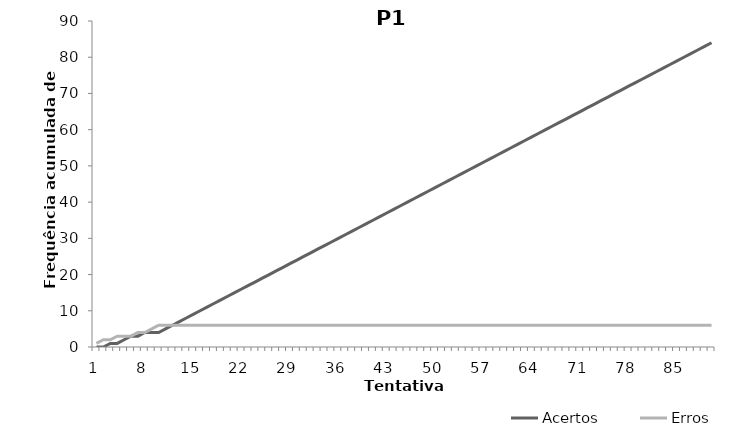
| Category | Acertos | Erros |
|---|---|---|
| 0 | 0 | 1 |
| 1 | 0 | 2 |
| 2 | 1 | 2 |
| 3 | 1 | 3 |
| 4 | 2 | 3 |
| 5 | 3 | 3 |
| 6 | 3 | 4 |
| 7 | 4 | 4 |
| 8 | 4 | 5 |
| 9 | 4 | 6 |
| 10 | 5 | 6 |
| 11 | 6 | 6 |
| 12 | 7 | 6 |
| 13 | 8 | 6 |
| 14 | 9 | 6 |
| 15 | 10 | 6 |
| 16 | 11 | 6 |
| 17 | 12 | 6 |
| 18 | 13 | 6 |
| 19 | 14 | 6 |
| 20 | 15 | 6 |
| 21 | 16 | 6 |
| 22 | 17 | 6 |
| 23 | 18 | 6 |
| 24 | 19 | 6 |
| 25 | 20 | 6 |
| 26 | 21 | 6 |
| 27 | 22 | 6 |
| 28 | 23 | 6 |
| 29 | 24 | 6 |
| 30 | 25 | 6 |
| 31 | 26 | 6 |
| 32 | 27 | 6 |
| 33 | 28 | 6 |
| 34 | 29 | 6 |
| 35 | 30 | 6 |
| 36 | 31 | 6 |
| 37 | 32 | 6 |
| 38 | 33 | 6 |
| 39 | 34 | 6 |
| 40 | 35 | 6 |
| 41 | 36 | 6 |
| 42 | 37 | 6 |
| 43 | 38 | 6 |
| 44 | 39 | 6 |
| 45 | 40 | 6 |
| 46 | 41 | 6 |
| 47 | 42 | 6 |
| 48 | 43 | 6 |
| 49 | 44 | 6 |
| 50 | 45 | 6 |
| 51 | 46 | 6 |
| 52 | 47 | 6 |
| 53 | 48 | 6 |
| 54 | 49 | 6 |
| 55 | 50 | 6 |
| 56 | 51 | 6 |
| 57 | 52 | 6 |
| 58 | 53 | 6 |
| 59 | 54 | 6 |
| 60 | 55 | 6 |
| 61 | 56 | 6 |
| 62 | 57 | 6 |
| 63 | 58 | 6 |
| 64 | 59 | 6 |
| 65 | 60 | 6 |
| 66 | 61 | 6 |
| 67 | 62 | 6 |
| 68 | 63 | 6 |
| 69 | 64 | 6 |
| 70 | 65 | 6 |
| 71 | 66 | 6 |
| 72 | 67 | 6 |
| 73 | 68 | 6 |
| 74 | 69 | 6 |
| 75 | 70 | 6 |
| 76 | 71 | 6 |
| 77 | 72 | 6 |
| 78 | 73 | 6 |
| 79 | 74 | 6 |
| 80 | 75 | 6 |
| 81 | 76 | 6 |
| 82 | 77 | 6 |
| 83 | 78 | 6 |
| 84 | 79 | 6 |
| 85 | 80 | 6 |
| 86 | 81 | 6 |
| 87 | 82 | 6 |
| 88 | 83 | 6 |
| 89 | 84 | 6 |